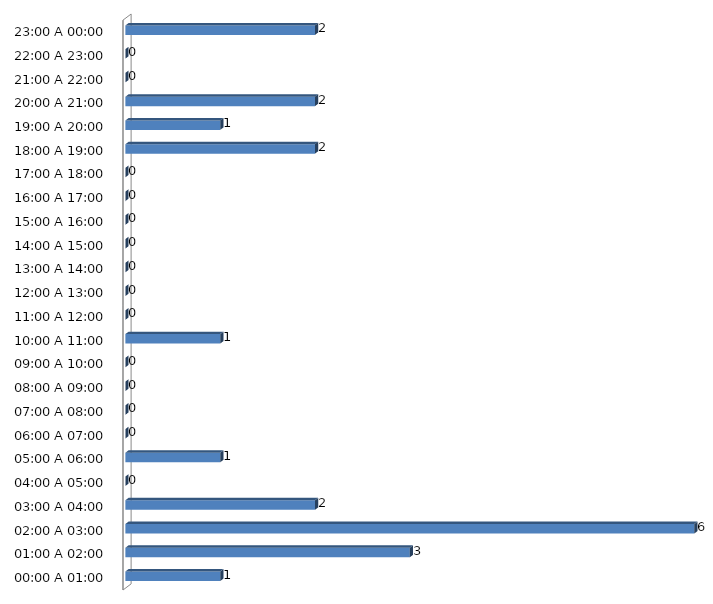
| Category | Series 0 |
|---|---|
| 00:00 A 01:00 | 1 |
| 01:00 A 02:00 | 3 |
| 02:00 A 03:00 | 6 |
| 03:00 A 04:00 | 2 |
| 04:00 A 05:00 | 0 |
| 05:00 A 06:00 | 1 |
| 06:00 A 07:00 | 0 |
| 07:00 A 08:00 | 0 |
| 08:00 A 09:00 | 0 |
| 09:00 A 10:00 | 0 |
| 10:00 A 11:00 | 1 |
| 11:00 A 12:00 | 0 |
| 12:00 A 13:00 | 0 |
| 13:00 A 14:00 | 0 |
| 14:00 A 15:00 | 0 |
| 15:00 A 16:00 | 0 |
| 16:00 A 17:00 | 0 |
| 17:00 A 18:00 | 0 |
| 18:00 A 19:00 | 2 |
| 19:00 A 20:00 | 1 |
| 20:00 A 21:00 | 2 |
| 21:00 A 22:00 | 0 |
| 22:00 A 23:00 | 0 |
| 23:00 A 00:00 | 2 |